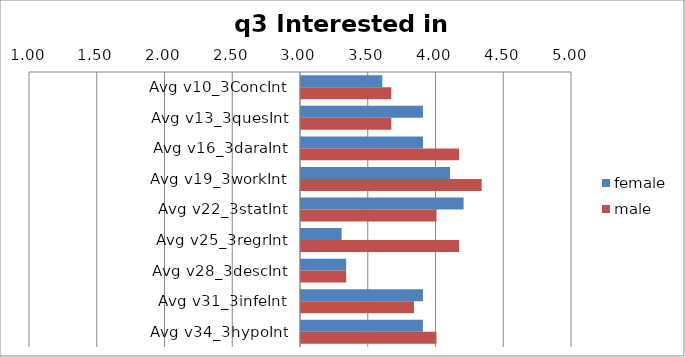
| Category | female | male |
|---|---|---|
| Avg v10_3ConcInt | 3.6 | 3.667 |
| Avg v13_3quesInt | 3.9 | 3.667 |
| Avg v16_3daraInt | 3.9 | 4.167 |
| Avg v19_3workInt | 4.1 | 4.333 |
| Avg v22_3statInt | 4.2 | 4 |
| Avg v25_3regrInt | 3.3 | 4.167 |
| Avg v28_3descInt | 3.333 | 3.333 |
| Avg v31_3infeInt | 3.9 | 3.833 |
| Avg v34_3hypoInt | 3.9 | 4 |